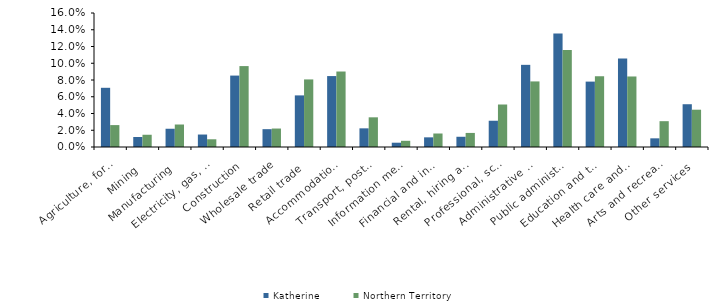
| Category | Katherine | Northern Territory |
|---|---|---|
| Agriculture, forestry and fishing | 0.071 | 0.026 |
| Mining | 0.012 | 0.015 |
| Manufacturing | 0.022 | 0.027 |
| Electricity, gas, water and waste services | 0.015 | 0.009 |
| Construction | 0.085 | 0.097 |
| Wholesale trade | 0.021 | 0.022 |
| Retail trade | 0.062 | 0.081 |
| Accommodation and food services | 0.085 | 0.09 |
| Transport, postal and warehousing | 0.022 | 0.035 |
| Information media and telecommunications | 0.005 | 0.007 |
| Financial and insurance services | 0.012 | 0.016 |
| Rental, hiring and real estate services | 0.012 | 0.017 |
| Professional, scientific and technical services | 0.031 | 0.051 |
| Administrative and support services | 0.098 | 0.078 |
| Public administration and safety | 0.136 | 0.116 |
| Education and training | 0.078 | 0.084 |
| Health care and social assistance | 0.106 | 0.084 |
| Arts and recreation services | 0.01 | 0.031 |
| Other services | 0.051 | 0.045 |